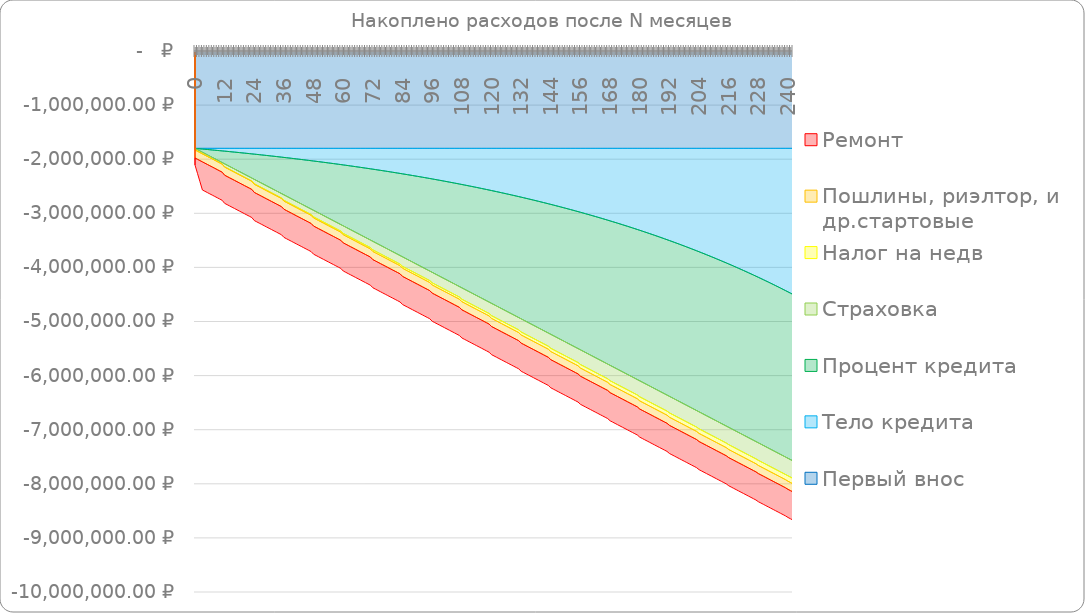
| Category | Первый внос | Тело кредита | Процент кредита | Страховка | Налог на недв | Пошлины, риэлтор, и др.стартовые | Ремонт |
|---|---|---|---|---|---|---|---|
| 0.0 | -1800000 | 0 | 0 | -27442.8 | 0 | -150000 | -130000 |
| 1.0 | -1800000 | -4073.87 | -19800 | -27442.8 | 0 | -150000 | -260000 |
| 2.0 | -1800000 | -8177.615 | -39570.125 | -27442.8 | 0 | -150000 | -390000 |
| 3.0 | -1800000 | -12311.454 | -59310.156 | -27442.8 | 0 | -150000 | -520000 |
| 4.0 | -1800000 | -16475.607 | -79019.872 | -27442.8 | 0 | -150000 | -520000 |
| 5.0 | -1800000 | -20670.298 | -98699.051 | -27442.8 | 0 | -150000 | -520000 |
| 6.0 | -1800000 | -24895.75 | -118347.468 | -27442.8 | 0 | -150000 | -520000 |
| 7.0 | -1800000 | -29152.189 | -137964.9 | -27442.8 | 0 | -150000 | -520000 |
| 8.0 | -1800000 | -33439.841 | -157551.117 | -27442.8 | 0 | -150000 | -520000 |
| 9.0 | -1800000 | -37758.937 | -177105.891 | -27442.8 | 0 | -150000 | -520000 |
| 10.0 | -1800000 | -42109.705 | -196628.993 | -27442.8 | 0 | -150000 | -520000 |
| 11.0 | -1800000 | -46492.379 | -216120.188 | -27442.8 | 0 | -150000 | -520000 |
| 12.0 | -1800000 | -50907.193 | -235579.244 | -54572.159 | -5000 | -150000 | -520000 |
| 13.0 | -1800000 | -55354.383 | -255005.925 | -54572.159 | -5000 | -150000 | -520000 |
| 14.0 | -1800000 | -59834.184 | -274399.992 | -54572.159 | -5000 | -150000 | -520000 |
| 15.0 | -1800000 | -64346.838 | -293761.208 | -54572.159 | -5000 | -150000 | -520000 |
| 16.0 | -1800000 | -68892.585 | -313089.332 | -54572.159 | -5000 | -150000 | -520000 |
| 17.0 | -1800000 | -73471.667 | -332384.119 | -54572.159 | -5000 | -150000 | -520000 |
| 18.0 | -1800000 | -78084.329 | -351645.327 | -54572.159 | -5000 | -150000 | -520000 |
| 19.0 | -1800000 | -82730.817 | -370872.709 | -54572.159 | -5000 | -150000 | -520000 |
| 20.0 | -1800000 | -87411.379 | -390066.016 | -54572.159 | -5000 | -150000 | -520000 |
| 21.0 | -1800000 | -92126.266 | -409224.999 | -54572.159 | -5000 | -150000 | -520000 |
| 22.0 | -1800000 | -96875.728 | -428349.407 | -54572.159 | -5000 | -150000 | -520000 |
| 23.0 | -1800000 | -101660.02 | -447438.985 | -54572.159 | -5000 | -150000 | -520000 |
| 24.0 | -1800000 | -106479.397 | -466493.478 | -81246.519 | -10000 | -150000 | -520000 |
| 25.0 | -1800000 | -111334.115 | -485512.629 | -81246.519 | -10000 | -150000 | -520000 |
| 26.0 | -1800000 | -116224.435 | -504496.179 | -81246.519 | -10000 | -150000 | -520000 |
| 27.0 | -1800000 | -121150.618 | -523443.866 | -81246.519 | -10000 | -150000 | -520000 |
| 28.0 | -1800000 | -126112.925 | -542355.428 | -81246.519 | -10000 | -150000 | -520000 |
| 29.0 | -1800000 | -131111.623 | -561230.6 | -81246.519 | -10000 | -150000 | -520000 |
| 30.0 | -1800000 | -136146.978 | -580069.115 | -81246.519 | -10000 | -150000 | -520000 |
| 31.0 | -1800000 | -141219.259 | -598870.704 | -81246.519 | -10000 | -150000 | -520000 |
| 32.0 | -1800000 | -146328.737 | -617635.096 | -81246.519 | -10000 | -150000 | -520000 |
| 33.0 | -1800000 | -151475.684 | -636362.018 | -81246.519 | -10000 | -150000 | -520000 |
| 34.0 | -1800000 | -156660.376 | -655051.197 | -81246.519 | -10000 | -150000 | -520000 |
| 35.0 | -1800000 | -161883.088 | -673702.354 | -81246.519 | -10000 | -150000 | -520000 |
| 36.0 | -1800000 | -167144.1 | -692315.211 | -100944.539 | -15000 | -150000 | -520000 |
| 37.0 | -1800000 | -172443.694 | -710889.488 | -100944.539 | -15000 | -150000 | -520000 |
| 38.0 | -1800000 | -177782.15 | -729424.901 | -100944.539 | -15000 | -150000 | -520000 |
| 39.0 | -1800000 | -183159.756 | -747921.165 | -100944.539 | -15000 | -150000 | -520000 |
| 40.0 | -1800000 | -188576.797 | -766377.994 | -100944.539 | -15000 | -150000 | -520000 |
| 41.0 | -1800000 | -194033.564 | -784795.097 | -100944.539 | -15000 | -150000 | -520000 |
| 42.0 | -1800000 | -199530.346 | -803172.184 | -100944.539 | -15000 | -150000 | -520000 |
| 43.0 | -1800000 | -205067.439 | -821508.962 | -100944.539 | -15000 | -150000 | -520000 |
| 44.0 | -1800000 | -210645.136 | -839805.134 | -100944.539 | -15000 | -150000 | -520000 |
| 45.0 | -1800000 | -216263.737 | -858060.403 | -100944.539 | -15000 | -150000 | -520000 |
| 46.0 | -1800000 | -221923.541 | -876274.469 | -100944.539 | -15000 | -150000 | -520000 |
| 47.0 | -1800000 | -227624.85 | -894447.029 | -100944.539 | -15000 | -150000 | -520000 |
| 48.0 | -1800000 | -233367.969 | -912577.781 | -120263.201 | -20000 | -150000 | -520000 |
| 49.0 | -1800000 | -239153.203 | -930666.415 | -120263.201 | -20000 | -150000 | -520000 |
| 50.0 | -1800000 | -244980.863 | -948712.625 | -120263.201 | -20000 | -150000 | -520000 |
| 51.0 | -1800000 | -250851.259 | -966716.099 | -120263.201 | -20000 | -150000 | -520000 |
| 52.0 | -1800000 | -256764.705 | -984676.523 | -120263.201 | -20000 | -150000 | -520000 |
| 53.0 | -1800000 | -262721.516 | -1002593.582 | -120263.201 | -20000 | -150000 | -520000 |
| 54.0 | -1800000 | -268722.01 | -1020466.957 | -120263.201 | -20000 | -150000 | -520000 |
| 55.0 | -1800000 | -274766.508 | -1038296.329 | -120263.201 | -20000 | -150000 | -520000 |
| 56.0 | -1800000 | -280855.332 | -1056081.375 | -120263.201 | -20000 | -150000 | -520000 |
| 57.0 | -1800000 | -286988.808 | -1073821.769 | -120263.201 | -20000 | -150000 | -520000 |
| 58.0 | -1800000 | -293167.262 | -1091517.185 | -120263.201 | -20000 | -150000 | -520000 |
| 59.0 | -1800000 | -299391.025 | -1109167.291 | -120263.201 | -20000 | -150000 | -520000 |
| 60.0 | -1800000 | -305660.429 | -1126771.757 | -139331.722 | -25000 | -150000 | -520000 |
| 61.0 | -1800000 | -311975.809 | -1144330.247 | -139331.722 | -25000 | -150000 | -520000 |
| 62.0 | -1800000 | -318337.501 | -1161842.425 | -139331.722 | -25000 | -150000 | -520000 |
| 63.0 | -1800000 | -324745.846 | -1179307.95 | -139331.722 | -25000 | -150000 | -520000 |
| 64.0 | -1800000 | -331201.185 | -1196726.48 | -139331.722 | -25000 | -150000 | -520000 |
| 65.0 | -1800000 | -337703.864 | -1214097.672 | -139331.722 | -25000 | -150000 | -520000 |
| 66.0 | -1800000 | -344254.228 | -1231421.177 | -139331.722 | -25000 | -150000 | -520000 |
| 67.0 | -1800000 | -350852.629 | -1248696.645 | -139331.722 | -25000 | -150000 | -520000 |
| 68.0 | -1800000 | -357499.418 | -1265923.726 | -139331.722 | -25000 | -150000 | -520000 |
| 69.0 | -1800000 | -364194.95 | -1283102.064 | -139331.722 | -25000 | -150000 | -520000 |
| 70.0 | -1800000 | -370939.583 | -1300231.301 | -139331.722 | -25000 | -150000 | -520000 |
| 71.0 | -1800000 | -377733.677 | -1317311.077 | -139331.722 | -25000 | -150000 | -520000 |
| 72.0 | -1800000 | -384577.593 | -1334341.03 | -157950.033 | -30000 | -150000 | -520000 |
| 73.0 | -1800000 | -391471.699 | -1351320.795 | -157950.033 | -30000 | -150000 | -520000 |
| 74.0 | -1800000 | -398416.361 | -1368250.002 | -157950.033 | -30000 | -150000 | -520000 |
| 75.0 | -1800000 | -405411.951 | -1385128.282 | -157950.033 | -30000 | -150000 | -520000 |
| 76.0 | -1800000 | -412458.842 | -1401955.261 | -157950.033 | -30000 | -150000 | -520000 |
| 77.0 | -1800000 | -419557.409 | -1418730.563 | -157950.033 | -30000 | -150000 | -520000 |
| 78.0 | -1800000 | -426708.034 | -1435453.809 | -157950.033 | -30000 | -150000 | -520000 |
| 79.0 | -1800000 | -433911.096 | -1452124.616 | -157950.033 | -30000 | -150000 | -520000 |
| 80.0 | -1800000 | -441166.98 | -1468742.602 | -157950.033 | -30000 | -150000 | -520000 |
| 81.0 | -1800000 | -448476.074 | -1485307.377 | -157950.033 | -30000 | -150000 | -520000 |
| 82.0 | -1800000 | -455838.769 | -1501818.553 | -157950.033 | -30000 | -150000 | -520000 |
| 83.0 | -1800000 | -463255.456 | -1518275.735 | -157950.033 | -30000 | -150000 | -520000 |
| 84.0 | -1800000 | -470726.533 | -1534678.528 | -176120.841 | -35000 | -150000 | -520000 |
| 85.0 | -1800000 | -478252.397 | -1551026.534 | -176120.841 | -35000 | -150000 | -520000 |
| 86.0 | -1800000 | -485833.451 | -1567319.35 | -176120.841 | -35000 | -150000 | -520000 |
| 87.0 | -1800000 | -493470.099 | -1583556.571 | -176120.841 | -35000 | -150000 | -520000 |
| 88.0 | -1800000 | -501162.75 | -1599737.79 | -176120.841 | -35000 | -150000 | -520000 |
| 89.0 | -1800000 | -508911.813 | -1615862.597 | -176120.841 | -35000 | -150000 | -520000 |
| 90.0 | -1800000 | -516717.703 | -1631930.577 | -176120.841 | -35000 | -150000 | -520000 |
| 91.0 | -1800000 | -524580.836 | -1647941.314 | -176120.841 | -35000 | -150000 | -520000 |
| 92.0 | -1800000 | -532501.632 | -1663894.387 | -176120.841 | -35000 | -150000 | -520000 |
| 93.0 | -1800000 | -540480.513 | -1679789.375 | -176120.841 | -35000 | -150000 | -520000 |
| 94.0 | -1800000 | -548517.907 | -1695625.852 | -176120.841 | -35000 | -150000 | -520000 |
| 95.0 | -1800000 | -556614.241 | -1711403.387 | -176120.841 | -35000 | -150000 | -520000 |
| 96.0 | -1800000 | -564769.949 | -1727121.549 | -193783.464 | -40000 | -150000 | -520000 |
| 97.0 | -1800000 | -572985.465 | -1742779.903 | -193783.464 | -40000 | -150000 | -520000 |
| 98.0 | -1800000 | -581261.228 | -1758378.01 | -193783.464 | -40000 | -150000 | -520000 |
| 99.0 | -1800000 | -589597.68 | -1773915.427 | -193783.464 | -40000 | -150000 | -520000 |
| 100.0 | -1800000 | -597995.266 | -1789391.711 | -193783.464 | -40000 | -150000 | -520000 |
| 101.0 | -1800000 | -606454.435 | -1804806.412 | -193783.464 | -40000 | -150000 | -520000 |
| 102.0 | -1800000 | -614975.637 | -1820159.08 | -193783.464 | -40000 | -150000 | -520000 |
| 103.0 | -1800000 | -623559.328 | -1835449.258 | -193783.464 | -40000 | -150000 | -520000 |
| 104.0 | -1800000 | -632205.966 | -1850676.49 | -193783.464 | -40000 | -150000 | -520000 |
| 105.0 | -1800000 | -640916.013 | -1865840.313 | -193783.464 | -40000 | -150000 | -520000 |
| 106.0 | -1800000 | -649689.934 | -1880940.262 | -193783.464 | -40000 | -150000 | -520000 |
| 107.0 | -1800000 | -658528.196 | -1895975.869 | -193783.464 | -40000 | -150000 | -520000 |
| 108.0 | -1800000 | -667431.273 | -1910946.663 | -210932.247 | -45000 | -150000 | -520000 |
| 109.0 | -1800000 | -676399.639 | -1925852.167 | -210932.247 | -45000 | -150000 | -520000 |
| 110.0 | -1800000 | -685433.772 | -1940691.903 | -210932.247 | -45000 | -150000 | -520000 |
| 111.0 | -1800000 | -694534.157 | -1955465.388 | -210932.247 | -45000 | -150000 | -520000 |
| 112.0 | -1800000 | -703701.277 | -1970172.138 | -210932.247 | -45000 | -150000 | -520000 |
| 113.0 | -1800000 | -712935.623 | -1984811.662 | -210932.247 | -45000 | -150000 | -520000 |
| 114.0 | -1800000 | -722237.687 | -1999383.467 | -210932.247 | -45000 | -150000 | -520000 |
| 115.0 | -1800000 | -731607.966 | -2013887.057 | -210932.247 | -45000 | -150000 | -520000 |
| 116.0 | -1800000 | -741046.961 | -2028321.932 | -210932.247 | -45000 | -150000 | -520000 |
| 117.0 | -1800000 | -750555.175 | -2042687.588 | -210932.247 | -45000 | -150000 | -520000 |
| 118.0 | -1800000 | -760133.116 | -2056983.517 | -210932.247 | -45000 | -150000 | -520000 |
| 119.0 | -1800000 | -769781.296 | -2071209.207 | -210932.247 | -45000 | -150000 | -520000 |
| 120.0 | -1800000 | -779500.228 | -2085364.144 | -227473.511 | -50000 | -150000 | -520000 |
| 121.0 | -1800000 | -789290.433 | -2099447.809 | -227473.511 | -50000 | -150000 | -520000 |
| 122.0 | -1800000 | -799152.433 | -2113459.679 | -227473.511 | -50000 | -150000 | -520000 |
| 123.0 | -1800000 | -809086.754 | -2127399.228 | -227473.511 | -50000 | -150000 | -520000 |
| 124.0 | -1800000 | -819093.926 | -2141265.925 | -227473.511 | -50000 | -150000 | -520000 |
| 125.0 | -1800000 | -829174.485 | -2155059.237 | -227473.511 | -50000 | -150000 | -520000 |
| 126.0 | -1800000 | -839328.968 | -2168778.624 | -227473.511 | -50000 | -150000 | -520000 |
| 127.0 | -1800000 | -849557.916 | -2182423.545 | -227473.511 | -50000 | -150000 | -520000 |
| 128.0 | -1800000 | -859861.878 | -2195993.453 | -227473.511 | -50000 | -150000 | -520000 |
| 129.0 | -1800000 | -870241.401 | -2209487.799 | -227473.511 | -50000 | -150000 | -520000 |
| 130.0 | -1800000 | -880697.041 | -2222906.029 | -227473.511 | -50000 | -150000 | -520000 |
| 131.0 | -1800000 | -891229.356 | -2236247.584 | -227473.511 | -50000 | -150000 | -520000 |
| 132.0 | -1800000 | -901838.908 | -2249511.902 | -243257.769 | -55000 | -150000 | -520000 |
| 133.0 | -1800000 | -912526.263 | -2262698.417 | -243257.769 | -55000 | -150000 | -520000 |
| 134.0 | -1800000 | -923291.992 | -2275806.558 | -243257.769 | -55000 | -150000 | -520000 |
| 135.0 | -1800000 | -934136.669 | -2288835.75 | -243257.769 | -55000 | -150000 | -520000 |
| 136.0 | -1800000 | -945060.875 | -2301785.414 | -243257.769 | -55000 | -150000 | -520000 |
| 137.0 | -1800000 | -956065.191 | -2314654.968 | -243257.769 | -55000 | -150000 | -520000 |
| 138.0 | -1800000 | -967150.206 | -2327443.823 | -243257.769 | -55000 | -150000 | -520000 |
| 139.0 | -1800000 | -978316.51 | -2340151.388 | -243257.769 | -55000 | -150000 | -520000 |
| 140.0 | -1800000 | -989564.701 | -2352777.067 | -243257.769 | -55000 | -150000 | -520000 |
| 141.0 | -1800000 | -1000895.379 | -2365320.259 | -243257.769 | -55000 | -150000 | -520000 |
| 142.0 | -1800000 | -1012309.148 | -2377780.36 | -243257.769 | -55000 | -150000 | -520000 |
| 143.0 | -1800000 | -1023806.618 | -2390156.759 | -243257.769 | -55000 | -150000 | -520000 |
| 144.0 | -1800000 | -1035388.403 | -2402448.844 | -258181.012 | -60000 | -150000 | -520000 |
| 145.0 | -1800000 | -1047055.121 | -2414655.996 | -258181.012 | -60000 | -150000 | -520000 |
| 146.0 | -1800000 | -1058807.395 | -2426777.592 | -258181.012 | -60000 | -150000 | -520000 |
| 147.0 | -1800000 | -1070645.852 | -2438813.004 | -258181.012 | -60000 | -150000 | -520000 |
| 148.0 | -1800000 | -1082571.125 | -2450761.601 | -258181.012 | -60000 | -150000 | -520000 |
| 149.0 | -1800000 | -1094583.85 | -2462622.746 | -258181.012 | -60000 | -150000 | -520000 |
| 150.0 | -1800000 | -1106684.668 | -2474395.798 | -258181.012 | -60000 | -150000 | -520000 |
| 151.0 | -1800000 | -1118874.225 | -2486080.111 | -258181.012 | -60000 | -150000 | -520000 |
| 152.0 | -1800000 | -1131153.172 | -2497675.033 | -258181.012 | -60000 | -150000 | -520000 |
| 153.0 | -1800000 | -1143522.165 | -2509179.91 | -258181.012 | -60000 | -150000 | -520000 |
| 154.0 | -1800000 | -1155981.864 | -2520594.08 | -258181.012 | -60000 | -150000 | -520000 |
| 155.0 | -1800000 | -1168532.935 | -2531916.88 | -258181.012 | -60000 | -150000 | -520000 |
| 156.0 | -1800000 | -1181176.046 | -2543147.639 | -271997.754 | -65000 | -150000 | -520000 |
| 157.0 | -1800000 | -1193911.873 | -2554285.681 | -271997.754 | -65000 | -150000 | -520000 |
| 158.0 | -1800000 | -1206741.097 | -2565330.327 | -271997.754 | -65000 | -150000 | -520000 |
| 159.0 | -1800000 | -1219664.401 | -2576280.892 | -271997.754 | -65000 | -150000 | -520000 |
| 160.0 | -1800000 | -1232682.477 | -2587136.687 | -271997.754 | -65000 | -150000 | -520000 |
| 161.0 | -1800000 | -1245796.018 | -2597897.015 | -271997.754 | -65000 | -150000 | -520000 |
| 162.0 | -1800000 | -1259005.725 | -2608561.178 | -271997.754 | -65000 | -150000 | -520000 |
| 163.0 | -1800000 | -1272312.304 | -2619128.469 | -271997.754 | -65000 | -150000 | -520000 |
| 164.0 | -1800000 | -1285716.464 | -2629598.179 | -271997.754 | -65000 | -150000 | -520000 |
| 165.0 | -1800000 | -1299218.921 | -2639969.592 | -271997.754 | -65000 | -150000 | -520000 |
| 166.0 | -1800000 | -1312820.396 | -2650241.986 | -271997.754 | -65000 | -150000 | -520000 |
| 167.0 | -1800000 | -1326521.615 | -2660414.637 | -271997.754 | -65000 | -150000 | -520000 |
| 168.0 | -1800000 | -1340323.31 | -2670486.811 | -284680.818 | -70000 | -150000 | -520000 |
| 169.0 | -1800000 | -1354226.218 | -2680457.774 | -284680.818 | -70000 | -150000 | -520000 |
| 170.0 | -1800000 | -1368231.08 | -2690326.782 | -284680.818 | -70000 | -150000 | -520000 |
| 171.0 | -1800000 | -1382338.644 | -2700093.087 | -284680.818 | -70000 | -150000 | -520000 |
| 172.0 | -1800000 | -1396549.664 | -2709755.937 | -284680.818 | -70000 | -150000 | -520000 |
| 173.0 | -1800000 | -1410864.898 | -2719314.573 | -284680.818 | -70000 | -150000 | -520000 |
| 174.0 | -1800000 | -1425285.11 | -2728768.23 | -284680.818 | -70000 | -150000 | -520000 |
| 175.0 | -1800000 | -1439811.071 | -2738116.139 | -284680.818 | -70000 | -150000 | -520000 |
| 176.0 | -1800000 | -1454443.555 | -2747357.525 | -284680.818 | -70000 | -150000 | -520000 |
| 177.0 | -1800000 | -1469183.344 | -2756491.605 | -284680.818 | -70000 | -150000 | -520000 |
| 178.0 | -1800000 | -1484031.225 | -2765517.594 | -284680.818 | -70000 | -150000 | -520000 |
| 179.0 | -1800000 | -1498987.991 | -2774434.699 | -284680.818 | -70000 | -150000 | -520000 |
| 180.0 | -1800000 | -1514054.439 | -2783242.12 | -296043.362 | -75000 | -150000 | -520000 |
| 181.0 | -1800000 | -1529231.375 | -2791939.054 | -296043.362 | -75000 | -150000 | -520000 |
| 182.0 | -1800000 | -1544519.608 | -2800524.691 | -296043.362 | -75000 | -150000 | -520000 |
| 183.0 | -1800000 | -1559919.955 | -2808998.214 | -296043.362 | -75000 | -150000 | -520000 |
| 184.0 | -1800000 | -1575433.238 | -2817358.801 | -296043.362 | -75000 | -150000 | -520000 |
| 185.0 | -1800000 | -1591060.284 | -2825605.623 | -296043.362 | -75000 | -150000 | -520000 |
| 186.0 | -1800000 | -1606801.93 | -2833737.848 | -296043.362 | -75000 | -150000 | -520000 |
| 187.0 | -1800000 | -1622659.013 | -2841754.634 | -296043.362 | -75000 | -150000 | -520000 |
| 188.0 | -1800000 | -1638632.383 | -2849655.134 | -296043.362 | -75000 | -150000 | -520000 |
| 189.0 | -1800000 | -1654722.89 | -2857438.497 | -296043.362 | -75000 | -150000 | -520000 |
| 190.0 | -1800000 | -1670931.394 | -2865103.862 | -296043.362 | -75000 | -150000 | -520000 |
| 191.0 | -1800000 | -1687258.761 | -2872650.366 | -296043.362 | -75000 | -150000 | -520000 |
| 192.0 | -1800000 | -1703705.862 | -2880077.135 | -305873.796 | -80000 | -150000 | -520000 |
| 193.0 | -1800000 | -1720273.574 | -2887383.292 | -305873.796 | -80000 | -150000 | -520000 |
| 194.0 | -1800000 | -1736962.784 | -2894567.952 | -305873.796 | -80000 | -150000 | -520000 |
| 195.0 | -1800000 | -1753774.381 | -2901630.225 | -305873.796 | -80000 | -150000 | -520000 |
| 196.0 | -1800000 | -1770709.262 | -2908569.213 | -305873.796 | -80000 | -150000 | -520000 |
| 197.0 | -1800000 | -1787768.333 | -2915384.012 | -305873.796 | -80000 | -150000 | -520000 |
| 198.0 | -1800000 | -1804952.504 | -2922073.711 | -305873.796 | -80000 | -150000 | -520000 |
| 199.0 | -1800000 | -1822262.692 | -2928637.392 | -305873.796 | -80000 | -150000 | -520000 |
| 200.0 | -1800000 | -1839699.822 | -2935074.132 | -305873.796 | -80000 | -150000 | -520000 |
| 201.0 | -1800000 | -1857264.824 | -2941383 | -305873.796 | -80000 | -150000 | -520000 |
| 202.0 | -1800000 | -1874958.636 | -2947563.058 | -305873.796 | -80000 | -150000 | -520000 |
| 203.0 | -1800000 | -1892782.202 | -2953613.362 | -305873.796 | -80000 | -150000 | -520000 |
| 204.0 | -1800000 | -1910736.475 | -2959532.959 | -313904.553 | -85000 | -150000 | -520000 |
| 205.0 | -1800000 | -1928822.412 | -2965320.891 | -313904.553 | -85000 | -150000 | -520000 |
| 206.0 | -1800000 | -1947040.979 | -2970976.194 | -313904.553 | -85000 | -150000 | -520000 |
| 207.0 | -1800000 | -1965393.15 | -2976497.893 | -313904.553 | -85000 | -150000 | -520000 |
| 208.0 | -1800000 | -1983879.902 | -2981885.01 | -313904.553 | -85000 | -150000 | -520000 |
| 209.0 | -1800000 | -2002502.225 | -2987136.558 | -313904.553 | -85000 | -150000 | -520000 |
| 210.0 | -1800000 | -2021261.111 | -2992251.541 | -313904.553 | -85000 | -150000 | -520000 |
| 211.0 | -1800000 | -2040157.562 | -2997228.96 | -313904.553 | -85000 | -150000 | -520000 |
| 212.0 | -1800000 | -2059192.587 | -3002067.804 | -313904.553 | -85000 | -150000 | -520000 |
| 213.0 | -1800000 | -2078367.203 | -3006767.059 | -313904.553 | -85000 | -150000 | -520000 |
| 214.0 | -1800000 | -2097682.432 | -3011325.699 | -313904.553 | -85000 | -150000 | -520000 |
| 215.0 | -1800000 | -2117139.306 | -3015742.695 | -313904.553 | -85000 | -150000 | -520000 |
| 216.0 | -1800000 | -2136738.864 | -3020017.006 | -319846.395 | -90000 | -150000 | -520000 |
| 217.0 | -1800000 | -2156482.153 | -3024147.588 | -319846.395 | -90000 | -150000 | -520000 |
| 218.0 | -1800000 | -2176370.225 | -3028133.386 | -319846.395 | -90000 | -150000 | -520000 |
| 219.0 | -1800000 | -2196404.143 | -3031973.337 | -319846.395 | -90000 | -150000 | -520000 |
| 220.0 | -1800000 | -2216584.976 | -3035666.374 | -319846.395 | -90000 | -150000 | -520000 |
| 221.0 | -1800000 | -2236913.803 | -3039211.417 | -319846.395 | -90000 | -150000 | -520000 |
| 222.0 | -1800000 | -2257391.707 | -3042607.383 | -319846.395 | -90000 | -150000 | -520000 |
| 223.0 | -1800000 | -2278019.783 | -3045853.177 | -319846.395 | -90000 | -150000 | -520000 |
| 224.0 | -1800000 | -2298799.131 | -3048947.698 | -319846.395 | -90000 | -150000 | -520000 |
| 225.0 | -1800000 | -2319730.861 | -3051889.838 | -319846.395 | -90000 | -150000 | -520000 |
| 226.0 | -1800000 | -2340816.09 | -3054678.478 | -319846.395 | -90000 | -150000 | -520000 |
| 227.0 | -1800000 | -2362055.945 | -3057312.494 | -319846.395 | -90000 | -150000 | -520000 |
| 228.0 | -1800000 | -2383451.558 | -3059790.75 | -323290.125 | -95000 | -150000 | -520000 |
| 229.0 | -1800000 | -2405004.073 | -3062112.105 | -323290.125 | -95000 | -150000 | -520000 |
| 230.0 | -1800000 | -2426714.639 | -3064275.409 | -323290.125 | -95000 | -150000 | -520000 |
| 231.0 | -1800000 | -2448584.416 | -3066279.501 | -323290.125 | -95000 | -150000 | -520000 |
| 232.0 | -1800000 | -2470614.571 | -3068123.216 | -323290.125 | -95000 | -150000 | -520000 |
| 233.0 | -1800000 | -2492806.281 | -3069805.376 | -323290.125 | -95000 | -150000 | -520000 |
| 234.0 | -1800000 | -2515160.731 | -3071324.796 | -323290.125 | -95000 | -150000 | -520000 |
| 235.0 | -1800000 | -2537679.112 | -3072680.284 | -323290.125 | -95000 | -150000 | -520000 |
| 236.0 | -1800000 | -2560362.629 | -3073870.637 | -323290.125 | -95000 | -150000 | -520000 |
| 237.0 | -1800000 | -2583212.491 | -3074894.645 | -323290.125 | -95000 | -150000 | -520000 |
| 238.0 | -1800000 | -2606229.919 | -3075751.086 | -323290.125 | -95000 | -150000 | -520000 |
| 239.0 | -1800000 | -2629416.142 | -3076438.734 | -323290.125 | -95000 | -150000 | -520000 |
| 240.0 | -1800000 | -2652772.397 | -3076956.349 | -323376.882 | -100000 | -150000 | -520000 |
| 241.0 | -1800000 | -2676299.931 | -3077302.684 | -323376.882 | -100000 | -150000 | -520000 |
| 242.0 | -1800000 | -2700000 | -3077476.485 | -323376.882 | -100000 | -150000 | -520000 |